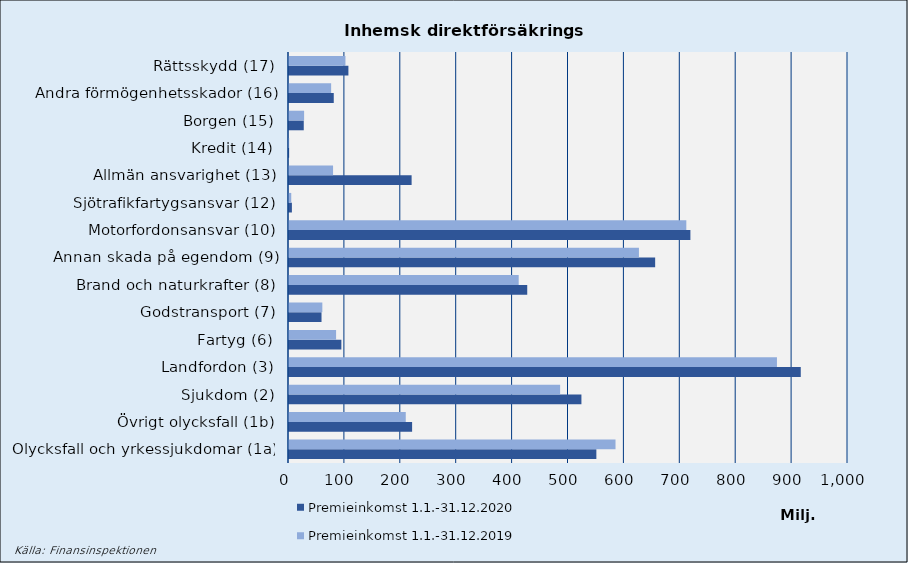
| Category | Premieinkomst |
|---|---|
| Olycksfall och yrkessjukdomar (1a) | 584107.618 |
| Övrigt olycksfall (1b) | 208878.114 |
| Sjukdom (2) | 485031.084 |
| Landfordon (3) | 872909.039 |
| Fartyg (6) | 84239.323 |
| Godstransport (7) | 59637.354 |
| Brand och naturkrafter (8) | 410901.802 |
| Annan skada på egendom (9) | 625996.929 |
| Motorfordonsansvar (10) | 710774.018 |
| Sjötrafikfartygsansvar (12) | 4030.047 |
| Allmän ansvarighet (13) | 78821.021 |
| Kredit (14) | 276.984 |
| Borgen (15) | 27025.959 |
| Andra förmögenhetsskador (16) | 75381.89 |
| Rättsskydd (17) | 100971.288 |